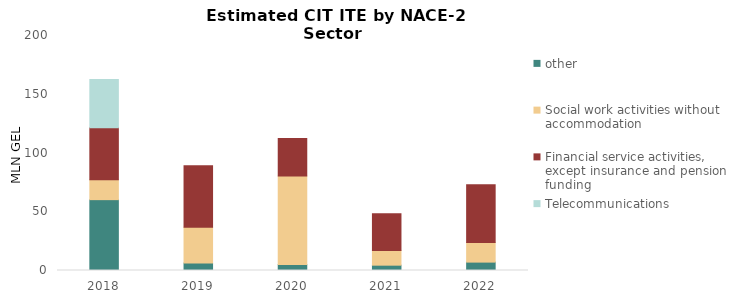
| Category | other | Social work activities without accommodation  | Financial service activities, except insurance and pension funding  | Telecommunications |
|---|---|---|---|---|
| 2018.0 | 60.3 | 16.96 | 44.31 | 40.89 |
| 2019.0 | 6.35 | 30.45 | 52.28 | 0 |
| 2020.0 | 5.02 | 75.36 | 31.94 | 0 |
| 2021.0 | 4.53 | 12.57 | 31.14 | 0 |
| 2022.0 | 7.14 | 16.63 | 49.22 | 0 |